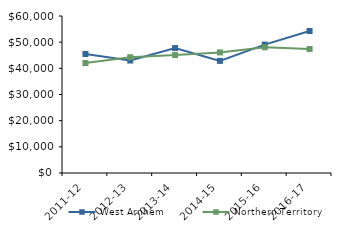
| Category | West Arnhem | Northern Territory |
|---|---|---|
| 2011-12 | 45473.14 | 42021 |
| 2012-13 | 42981.43 | 44232.02 |
| 2013-14 | 47749.5 | 45075.51 |
| 2014-15 | 42846.02 | 46083.65 |
| 2015-16 | 49079 | 48046.27 |
| 2016-17 | 54277.04 | 47367.05 |